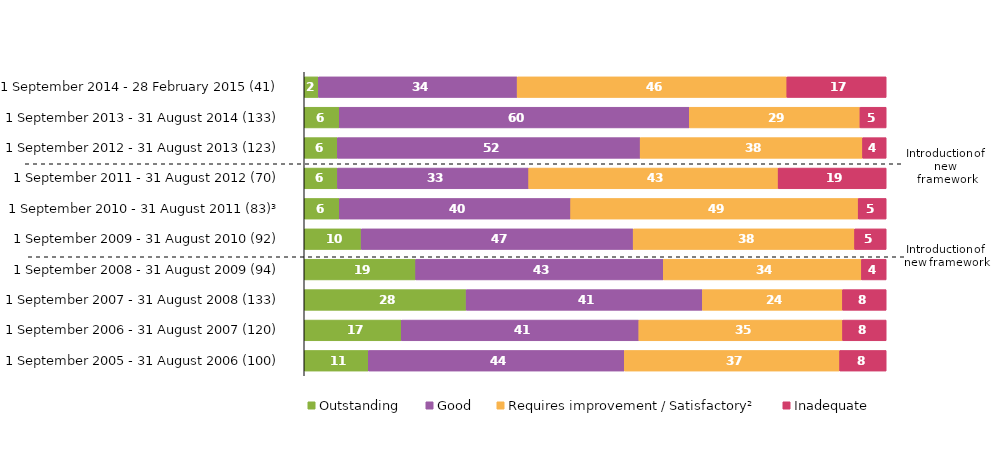
| Category | Outstanding | Good | Requires improvement / Satisfactory² | Inadequate |
|---|---|---|---|---|
| 1 September 2014 - 28 February 2015 (41) | 2.439 | 34.146 | 46.341 | 17.073 |
| 1 September 2013 - 31 August 2014 (133) | 6.015 | 60.15 | 29.323 | 4.511 |
| 1 September 2012 - 31 August 2013 (123) | 5.691 | 52.033 | 38.211 | 4.065 |
| 1 September 2011 - 31 August 2012 (70) | 5.714 | 32.857 | 42.857 | 18.571 |
| 1 September 2010 - 31 August 2011 (83)³ | 6.024 | 39.759 | 49.398 | 4.819 |
| 1 September 2009 - 31 August 2010 (92) | 9.783 | 46.739 | 38.043 | 5.435 |
| 1 September 2008 - 31 August 2009 (94) | 19.149 | 42.553 | 34.043 | 4.255 |
| 1 September 2007 - 31 August 2008 (133) | 27.82 | 40.602 | 24.06 | 7.519 |
| 1 September 2006 - 31 August 2007 (120) | 16.667 | 40.833 | 35 | 7.5 |
| 1 September 2005 - 31 August 2006 (100) | 11 | 44 | 37 | 8 |